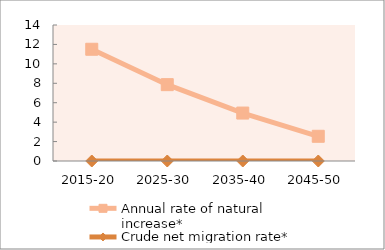
| Category | Annual rate of natural increase* | Crude net migration rate* |
|---|---|---|
| 2015-20 | 11.503 | 0 |
| 2025-30 | 7.859 | 0 |
| 2035-40 | 4.935 | 0 |
| 2045-50 | 2.544 | 0 |